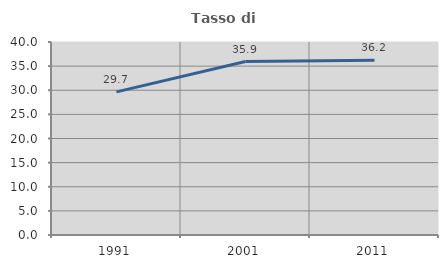
| Category | Tasso di occupazione   |
|---|---|
| 1991.0 | 29.667 |
| 2001.0 | 35.942 |
| 2011.0 | 36.243 |